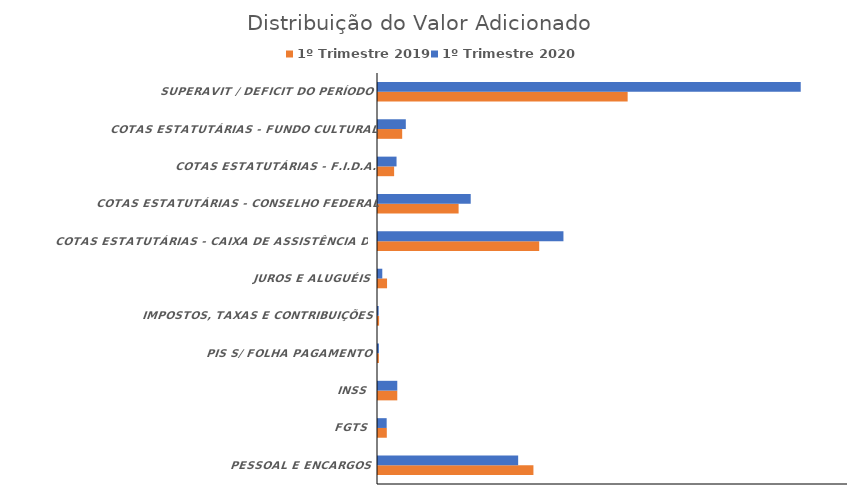
| Category | 1º Trimestre 2019 | 1º Trimestre 2020 |
|---|---|---|
| PESSOAL E ENCARGOS | 5291278.15 | 4771515.26 |
| FGTS | 299969.27 | 295155.27 |
| INSS | 656052.71 | 656348.29 |
| PIS S/ FOLHA PAGAMENTO | 30569.25 | 30837.59 |
| IMPOSTOS, TAXAS E CONTRIBUIÇÕES | 37760.65 | 22968.57 |
| JUROS E ALUGUÉIS | 307822.38 | 145937.43 |
| COTAS ESTATUTÁRIAS - CAIXA DE ASSISTÊNCIA DOS ADVOGADOS | 5487827.77 | 6313008.27 |
| COTAS ESTATUTÁRIAS - CONSELHO FEDERAL | 2743913.89 | 3156504.14 |
| COTAS ESTATUTÁRIAS - F.I.D.A. | 548782.77 | 631300.83 |
| COTAS ESTATUTÁRIAS - FUNDO CULTURAL | 823174.17 | 946951.24 |
| SUPERAVIT / DEFICIT DO PERÍODO | 8498583.4 | 14390850.73 |